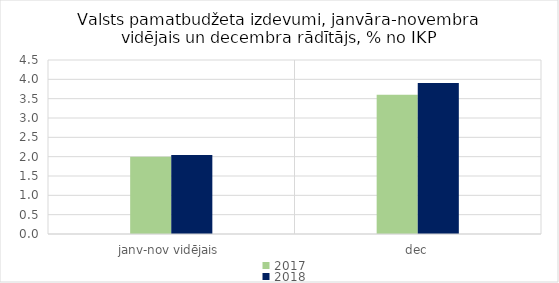
| Category | 2017 | 2018 |
|---|---|---|
| janv-nov vidējais | 1.998 | 2.045 |
| dec | 3.603 | 3.906 |